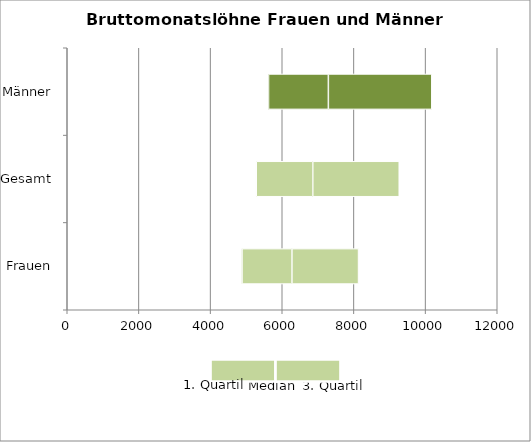
| Category | Q1 | M-Q1 | Q3-M |
|---|---|---|---|
| Frauen | 4877 | 1393 | 1859 |
| Gesamt | 5274 | 1578 | 2413 |
| Männer | 5617 | 1670 | 2887 |